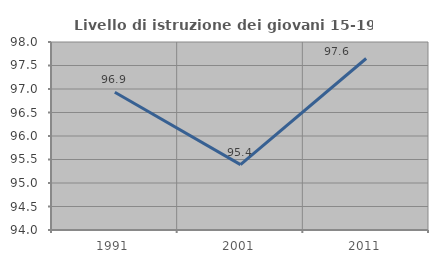
| Category | Livello di istruzione dei giovani 15-19 anni |
|---|---|
| 1991.0 | 96.932 |
| 2001.0 | 95.391 |
| 2011.0 | 97.649 |